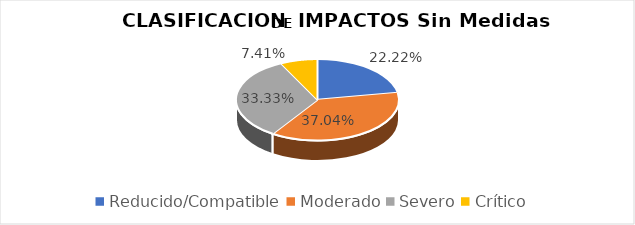
| Category | Series 0 |
|---|---|
| Reducido/Compatible | 0.222 |
| Moderado | 0.37 |
| Severo | 0.333 |
| Crítico | 0.074 |